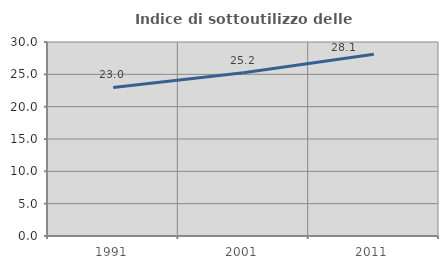
| Category | Indice di sottoutilizzo delle abitazioni  |
|---|---|
| 1991.0 | 22.981 |
| 2001.0 | 25.231 |
| 2011.0 | 28.118 |